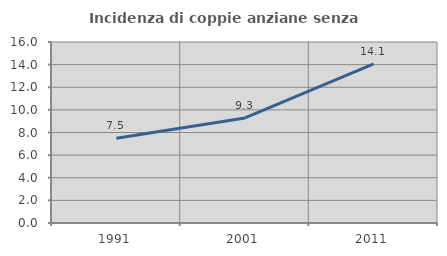
| Category | Incidenza di coppie anziane senza figli  |
|---|---|
| 1991.0 | 7.498 |
| 2001.0 | 9.285 |
| 2011.0 | 14.065 |